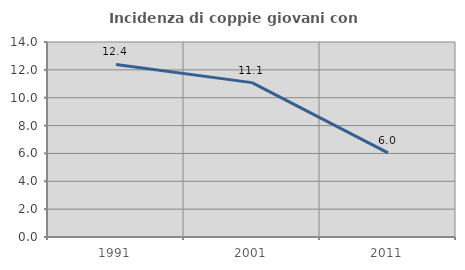
| Category | Incidenza di coppie giovani con figli |
|---|---|
| 1991.0 | 12.385 |
| 2001.0 | 11.084 |
| 2011.0 | 6.037 |